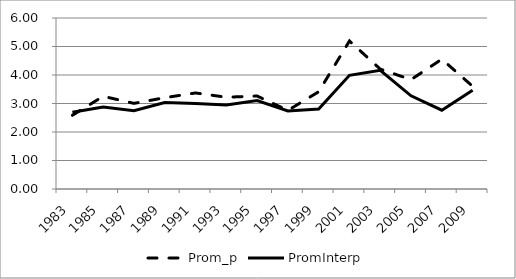
| Category | Prom_p | PromInterp |
|---|---|---|
| 1983.0 | 2.587 | 2.694 |
| 1985.0 | 3.253 | 2.875 |
| 1987.0 | 3.004 | 2.744 |
| 1989.0 | 3.204 | 3.035 |
| 1991.0 | 3.37 | 2.999 |
| 1993.0 | 3.22 | 2.948 |
| 1995.0 | 3.263 | 3.103 |
| 1997.0 | 2.758 | 2.74 |
| 1999.0 | 3.413 | 2.806 |
| 2001.0 | 5.193 | 3.989 |
| 2003.0 | 4.207 | 4.166 |
| 2005.0 | 3.838 | 3.27 |
| 2007.0 | 4.556 | 2.765 |
| 2009.0 | 3.604 | 3.464 |